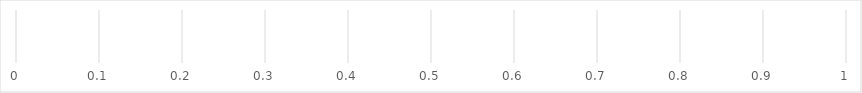
| Category | C | G | LG | LA | A | LR | R | NA |
|---|---|---|---|---|---|---|---|---|
| Solution & Technology Readiness | 0 | 0 | 0 | 0 | 0 | 0 | 0 | 0 |